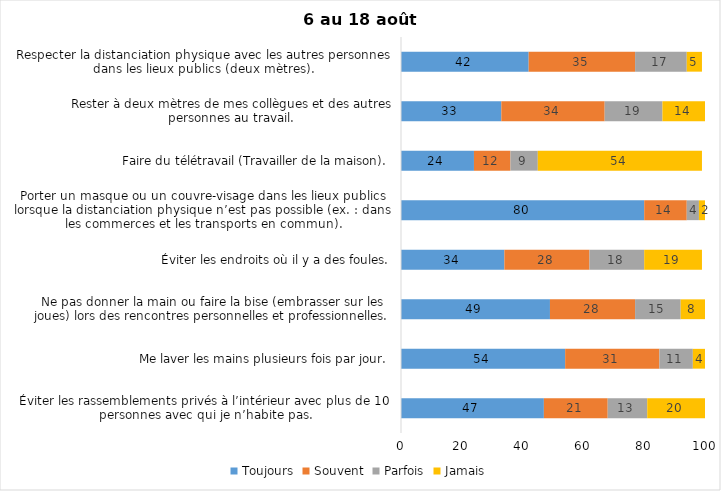
| Category | Toujours | Souvent | Parfois | Jamais |
|---|---|---|---|---|
| Éviter les rassemblements privés à l’intérieur avec plus de 10 personnes avec qui je n’habite pas. | 47 | 21 | 13 | 20 |
| Me laver les mains plusieurs fois par jour. | 54 | 31 | 11 | 4 |
| Ne pas donner la main ou faire la bise (embrasser sur les joues) lors des rencontres personnelles et professionnelles. | 49 | 28 | 15 | 8 |
| Éviter les endroits où il y a des foules. | 34 | 28 | 18 | 19 |
| Porter un masque ou un couvre-visage dans les lieux publics lorsque la distanciation physique n’est pas possible (ex. : dans les commerces et les transports en commun). | 80 | 14 | 4 | 2 |
| Faire du télétravail (Travailler de la maison). | 24 | 12 | 9 | 54 |
| Rester à deux mètres de mes collègues et des autres personnes au travail. | 33 | 34 | 19 | 14 |
| Respecter la distanciation physique avec les autres personnes dans les lieux publics (deux mètres). | 42 | 35 | 17 | 5 |